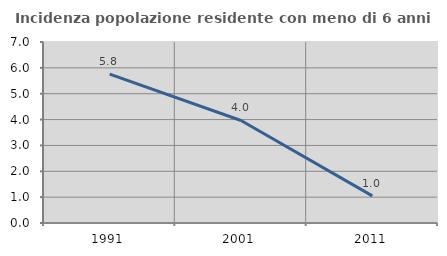
| Category | Incidenza popolazione residente con meno di 6 anni |
|---|---|
| 1991.0 | 5.758 |
| 2001.0 | 3.965 |
| 2011.0 | 1.047 |